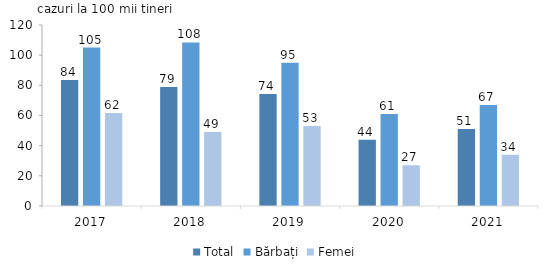
| Category | Total | Bărbați | Femei |
|---|---|---|---|
| 2017.0 | 83.54 | 105.072 | 61.664 |
| 2018.0 | 78.949 | 108.443 | 49.115 |
| 2019.0 | 74.336 | 95 | 53 |
| 2020.0 | 44 | 61 | 27 |
| 2021.0 | 51 | 67 | 34 |